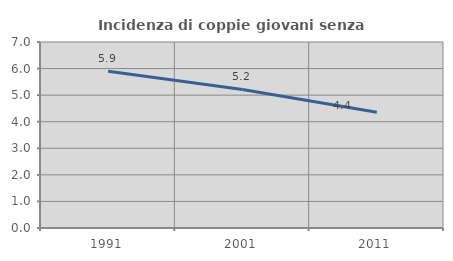
| Category | Incidenza di coppie giovani senza figli |
|---|---|
| 1991.0 | 5.899 |
| 2001.0 | 5.214 |
| 2011.0 | 4.355 |